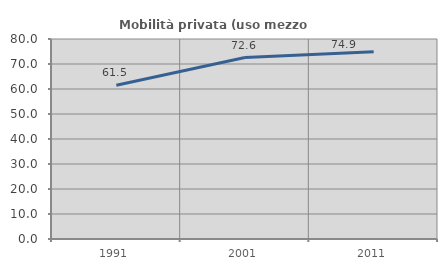
| Category | Mobilità privata (uso mezzo privato) |
|---|---|
| 1991.0 | 61.469 |
| 2001.0 | 72.573 |
| 2011.0 | 74.88 |